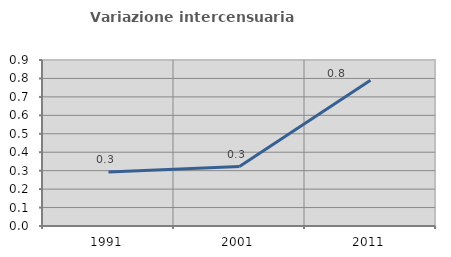
| Category | Variazione intercensuaria annua |
|---|---|
| 1991.0 | 0.293 |
| 2001.0 | 0.322 |
| 2011.0 | 0.791 |